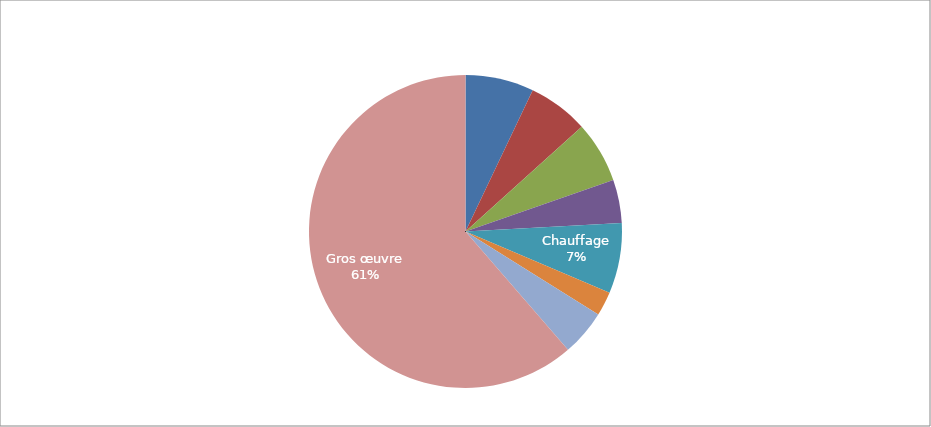
| Category | Series 0 |
|---|---|
| Electricité | 312 |
| Plomberie :  | 276 |
| Ascenceur | 280 |
| Menuiseries | 198 |
| Chauffage | 320 |
| Etanchéité | 110 |
| Ravalement améliorations | 210 |
| Gros œuvre | 2709 |